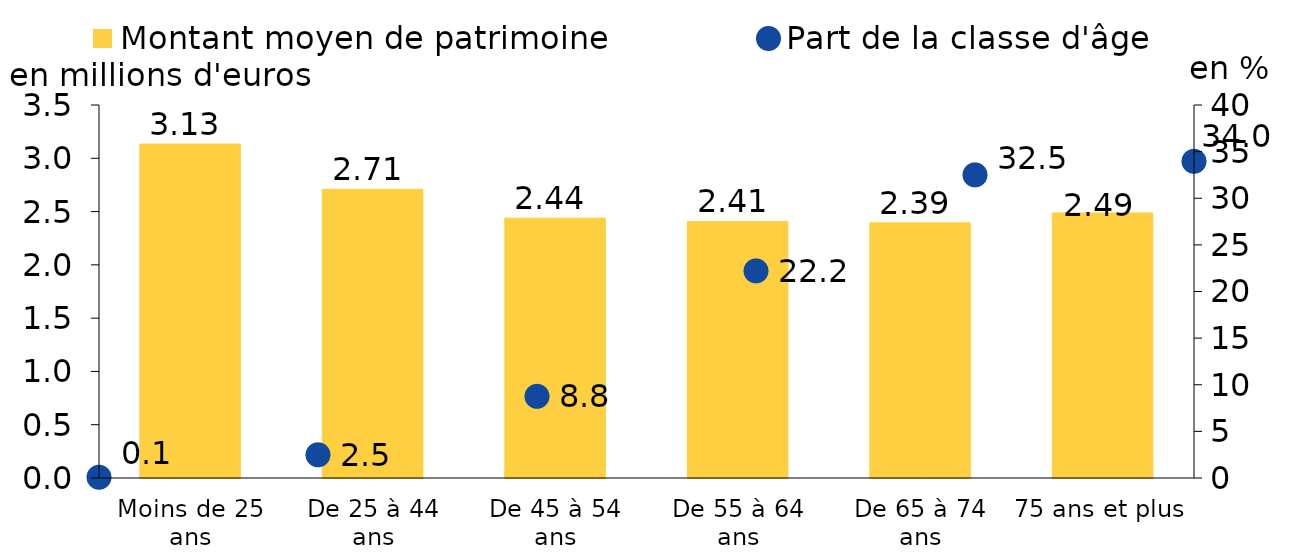
| Category | Montant moyen de patrimoine |
|---|---|
| Moins de 25 ans | 3.134 |
| De 25 à 44 ans | 2.709 |
| De 45 à 54 ans | 2.438 |
| De 55 à 64 ans | 2.407 |
| De 65 à 74 ans | 2.394 |
| 75 ans et plus | 2.487 |